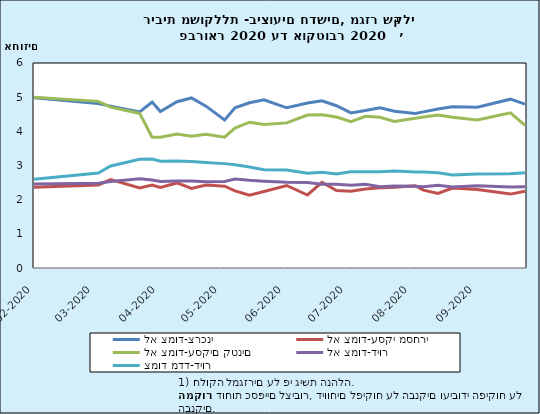
| Category | לא צמוד-צרכני | לא צמוד-עסקי מסחרי | לא צמוד-עסקים קטנים | לא צמוד-דיור | צמוד מדד-דיור |
|---|---|---|---|---|---|
| 2020-02-29 02:00:00 | 4.985 | 2.361 | 4.996 | 2.457 | 2.599 |
| 2020-03-31 03:00:00 | 4.814 | 2.432 | 4.877 | 2.483 | 2.782 |
| 2020-04-06 03:00:00 | 4.739 | 2.587 | 4.708 | 2.531 | 2.986 |
| 2020-04-20 03:00:00 | 4.57 | 2.342 | 4.524 | 2.614 | 3.184 |
| 2020-04-26 03:00:00 | 4.857 | 2.43 | 3.828 | 2.573 | 3.187 |
| 2020-04-30 03:00:00 | 4.579 | 2.361 | 3.825 | 2.535 | 3.125 |
| 2020-05-08 03:00:00 | 4.867 | 2.489 | 3.92 | 2.549 | 3.13 |
| 2020-05-15 03:00:00 | 4.977 | 2.33 | 3.856 | 2.547 | 3.117 |
| 2020-05-22 03:00:00 | 4.737 | 2.43 | 3.913 | 2.523 | 3.085 |
| 2020-05-31 03:00:00 | 4.332 | 2.396 | 3.83 | 2.534 | 3.055 |
| 2020-06-05 03:00:00 | 4.688 | 2.258 | 4.094 | 2.602 | 3.025 |
| 2020-06-12 03:00:00 | 4.837 | 2.133 | 4.267 | 2.566 | 2.954 |
| 2020-06-19 03:00:00 | 4.924 | 2.238 | 4.203 | 2.542 | 2.878 |
| 2020-06-30 03:00:00 | 4.689 | 2.415 | 4.247 | 2.509 | 2.869 |
| 2020-07-10 03:00:00 | 4.827 | 2.137 | 4.478 | 2.5 | 2.775 |
| 2020-07-17 03:00:00 | 4.894 | 2.509 | 4.488 | 2.454 | 2.803 |
| 2020-07-24 03:00:00 | 4.75 | 2.27 | 4.42 | 2.45 | 2.75 |
| 2020-07-31 03:00:00 | 4.54 | 2.25 | 4.28 | 2.42 | 2.82 |
| 2020-08-07 03:00:00 | 4.61 | 2.31 | 4.44 | 2.45 | 2.82 |
| 2020-08-14 03:00:00 | 4.69 | 2.35 | 4.41 | 2.38 | 2.82 |
| 2020-08-21 03:00:00 | 4.59 | 2.36 | 4.29 | 2.4 | 2.84 |
| 2020-08-31 03:00:00 | 4.52 | 2.41 | 4.38 | 2.39 | 2.81 |
| 2020-09-04 03:00:00 | 4.57 | 2.28 | 4.42 | 2.38 | 2.81 |
| 2020-09-11 03:00:00 | 4.654 | 2.184 | 4.478 | 2.421 | 2.787 |
| 2020-09-18 03:00:00 | 4.722 | 2.341 | 4.414 | 2.372 | 2.721 |
| 2020-09-30 03:00:00 | 4.705 | 2.296 | 4.331 | 2.409 | 2.749 |
| 2020-10-16 03:00:00 | 4.941 | 2.163 | 4.544 | 2.37 | 2.761 |
| 2020-10-23 03:00:00 | 4.797 | 2.245 | 4.176 | 2.377 | 2.787 |